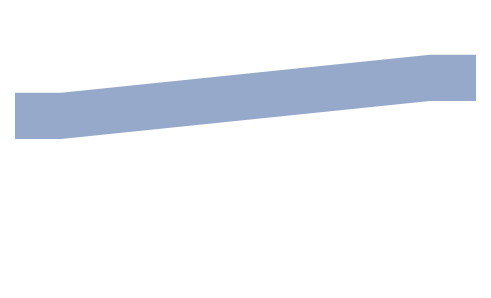
| Category | Series 0 | Series 1 | 4350 |
|---|---|---|---|
| 0.0 | 2350 | 1400 | 4350 |
| 10.0 | 2350 | 1400 | 4350 |
| 90.0 | 1200 | 1400 | 5500 |
| 100.0 | 1200 | 1400 | 5500 |